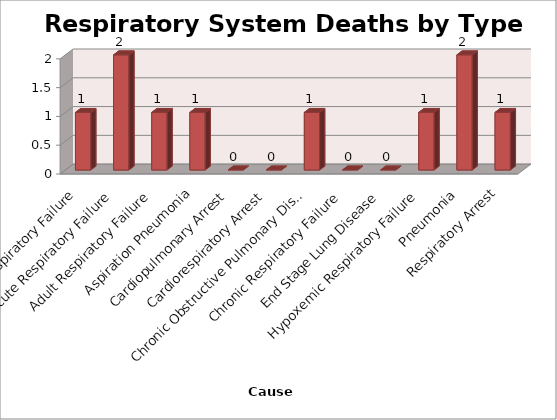
| Category | Series 0 |
|---|---|
| Acute Hypoxemic Respiratory Failure | 1 |
| Acute Respiratory Failure | 2 |
| Adult Respiratory Failure | 1 |
| Aspiration Pneumonia | 1 |
| Cardiopulmonary Arrest | 0 |
| Cardiorespiratory Arrest | 0 |
| Chronic Obstructive Pulmonary Disease | 1 |
| Chronic Respiratory Failure | 0 |
| End Stage Lung Disease | 0 |
| Hypoxemic Respiratory Failure | 1 |
| Pneumonia | 2 |
| Respiratory Arrest | 1 |